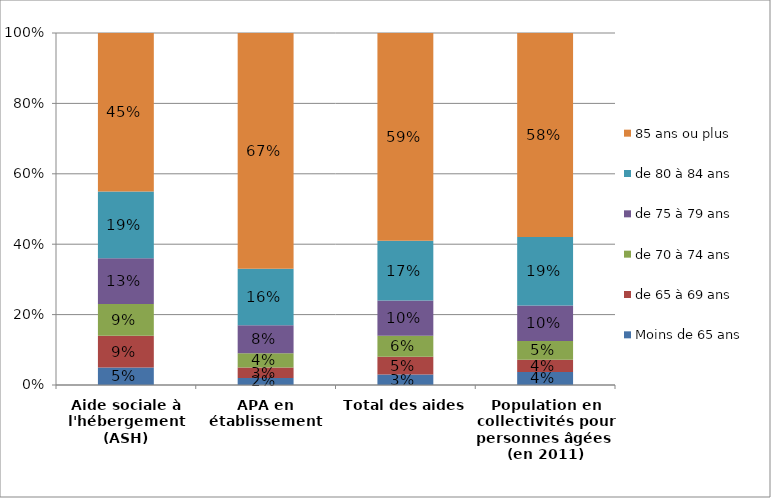
| Category | Moins de 65 ans | de 65 à 69 ans | de 70 à 74 ans | de 75 à 79 ans | de 80 à 84 ans | 85 ans ou plus |
|---|---|---|---|---|---|---|
| Aide sociale à l'hébergement (ASH) | 0.05 | 0.09 | 0.09 | 0.13 | 0.19 | 0.45 |
| APA en établissement | 0.02 | 0.03 | 0.04 | 0.08 | 0.16 | 0.67 |
| Total des aides | 0.03 | 0.05 | 0.06 | 0.1 | 0.17 | 0.59 |
| Population en collectivités pour personnes âgées 
(en 2011) | 0.037 | 0.035 | 0.053 | 0.101 | 0.195 | 0.579 |